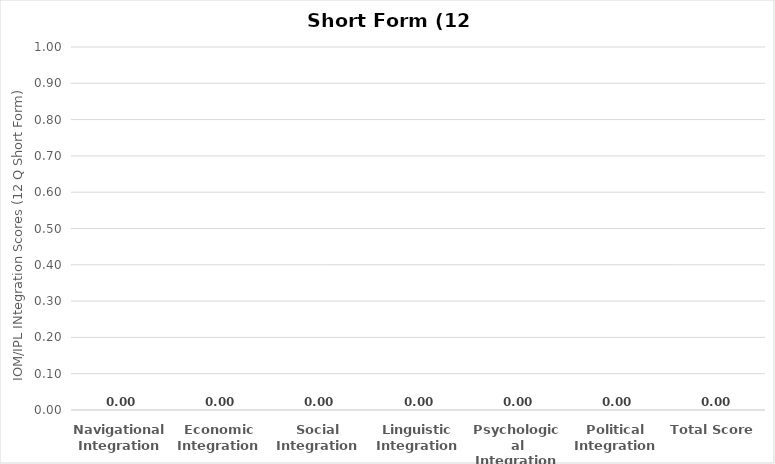
| Category | Series 0 |
|---|---|
| Navigational Integration | 0 |
| Economic Integration | 0 |
| Social Integration | 0 |
| Linguistic Integration | 0 |
| Psychological Integration | 0 |
| Political Integration | 0 |
| Total Score | 0 |